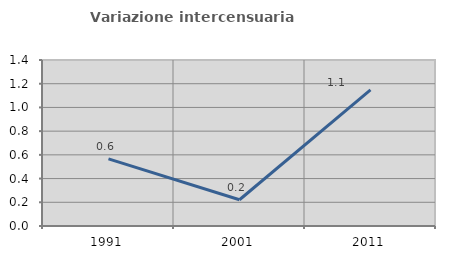
| Category | Variazione intercensuaria annua |
|---|---|
| 1991.0 | 0.566 |
| 2001.0 | 0.221 |
| 2011.0 | 1.147 |